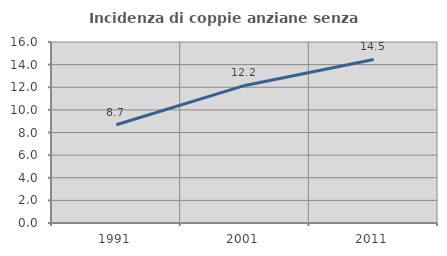
| Category | Incidenza di coppie anziane senza figli  |
|---|---|
| 1991.0 | 8.682 |
| 2001.0 | 12.161 |
| 2011.0 | 14.459 |